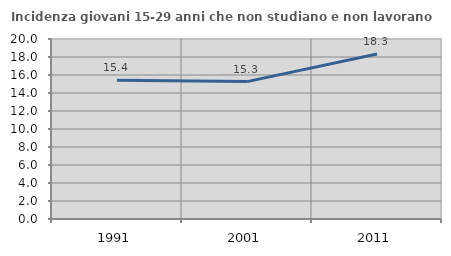
| Category | Incidenza giovani 15-29 anni che non studiano e non lavorano  |
|---|---|
| 1991.0 | 15.419 |
| 2001.0 | 15.267 |
| 2011.0 | 18.333 |